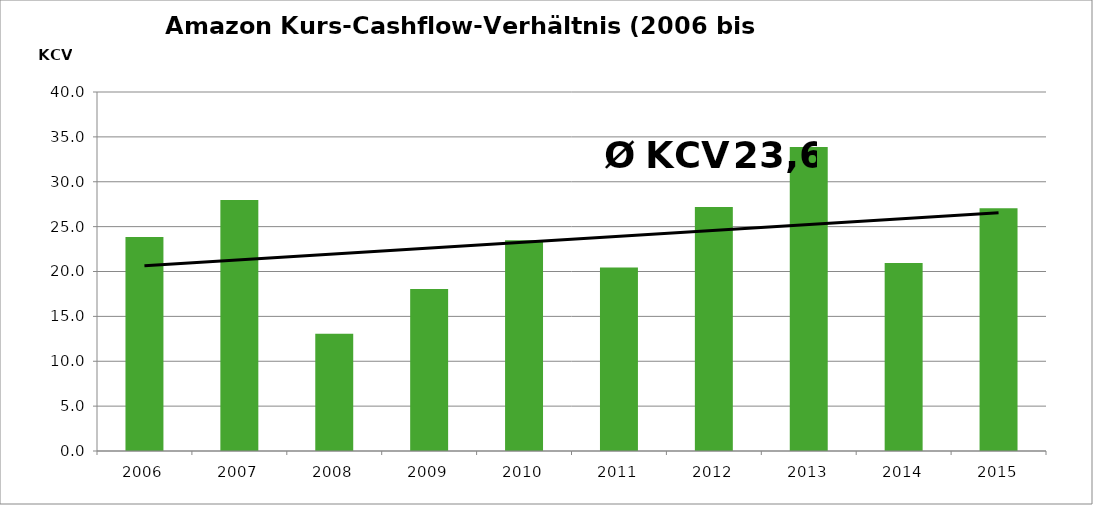
| Category | Series 0 |
|---|---|
| 2006.0 | 23.833 |
| 2007.0 | 27.957 |
| 2008.0 | 13.054 |
| 2009.0 | 18.056 |
| 2010.0 | 23.485 |
| 2011.0 | 20.446 |
| 2012.0 | 27.188 |
| 2013.0 | 33.87 |
| 2014.0 | 20.956 |
| 2015.0 | 27.047 |